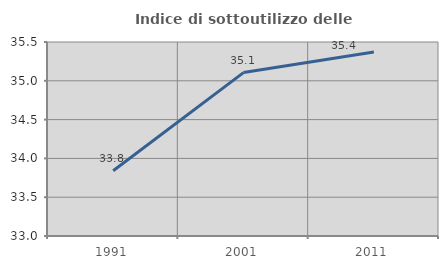
| Category | Indice di sottoutilizzo delle abitazioni  |
|---|---|
| 1991.0 | 33.84 |
| 2001.0 | 35.106 |
| 2011.0 | 35.37 |